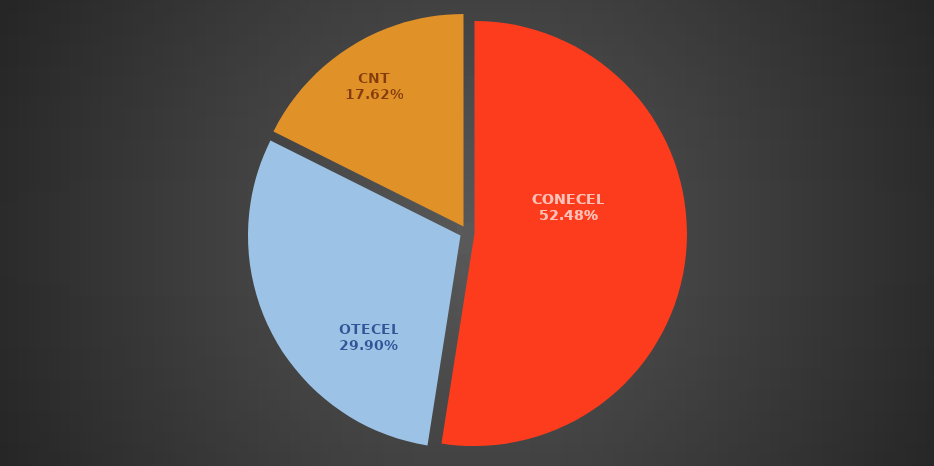
| Category | Sep 2018 |
|---|---|
| CONECEL | 8160472 |
| OTECEL | 4648800 |
| CNT | 2739272 |